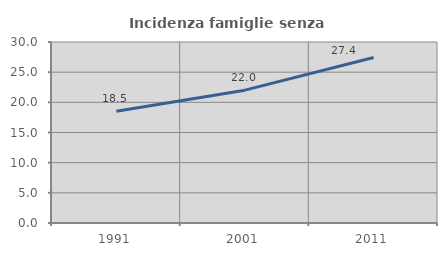
| Category | Incidenza famiglie senza nuclei |
|---|---|
| 1991.0 | 18.529 |
| 2001.0 | 22.019 |
| 2011.0 | 27.434 |